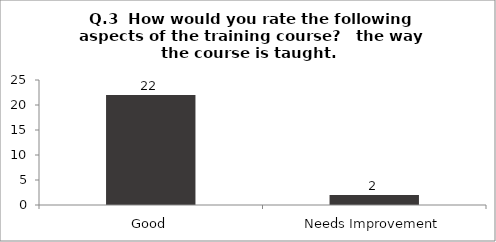
| Category | Q.3  How would you rate the following aspects of the training course?  |
|---|---|
| Good | 22 |
| Needs Improvement | 2 |